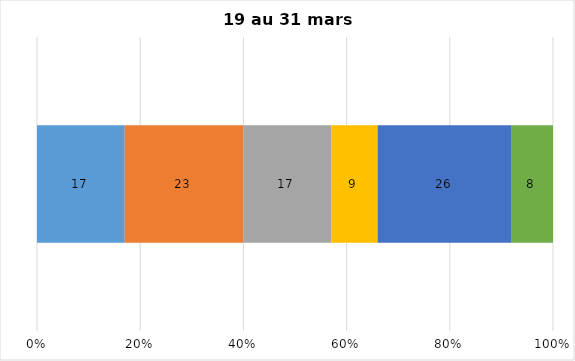
| Category | Plusieurs fois par jour | Une fois par jour | Quelques fois par semaine   | Une fois par semaine ou moins   |  Jamais   |  Je n’utilise pas les médias sociaux |
|---|---|---|---|---|---|---|
| 0 | 17 | 23 | 17 | 9 | 26 | 8 |